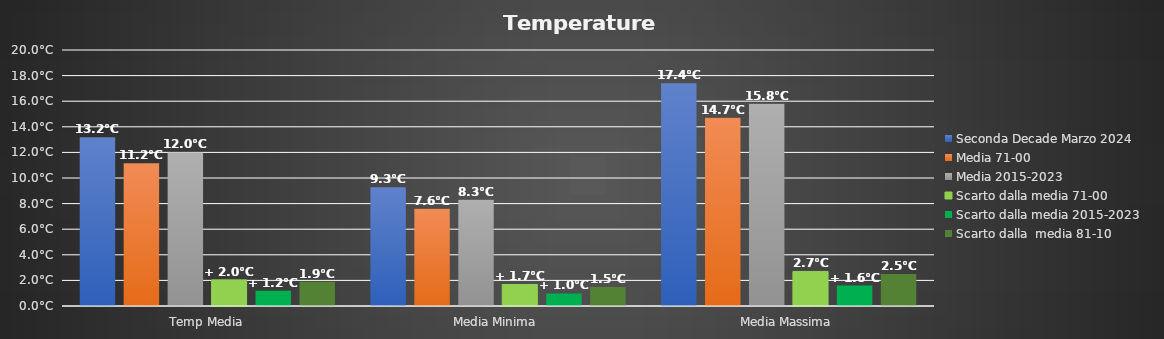
| Category | Seconda Decade Marzo 2024 | Media 71-00 | Media 2015-2023 | Scarto dalla media 71-00 | Scarto dalla media 2015-2023 | Scarto dalla  media 81-10 |
|---|---|---|---|---|---|---|
| Temp Media | 13.191 | 11.15 | 12 | 2.041 | 1.191 | 1.891 |
| Media Minima  | 9.28 | 7.6 | 8.3 | 1.68 | 0.98 | 1.48 |
| Media Massima | 17.4 | 14.7 | 15.8 | 2.7 | 1.6 | 2.5 |